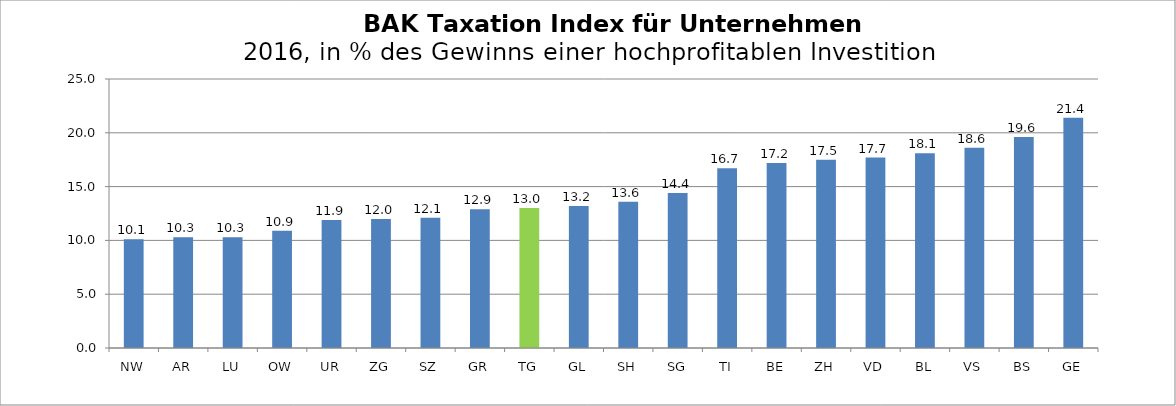
| Category | Series 0 |
|---|---|
| NW | 10.1 |
| AR | 10.3 |
| LU | 10.3 |
| OW | 10.9 |
| UR | 11.9 |
| ZG | 12 |
| SZ | 12.1 |
| GR | 12.9 |
| TG | 13 |
| GL | 13.2 |
| SH | 13.6 |
| SG | 14.4 |
| TI | 16.7 |
| BE | 17.2 |
| ZH | 17.5 |
| VD | 17.7 |
| BL | 18.1 |
| VS | 18.6 |
| BS | 19.6 |
| GE | 21.4 |